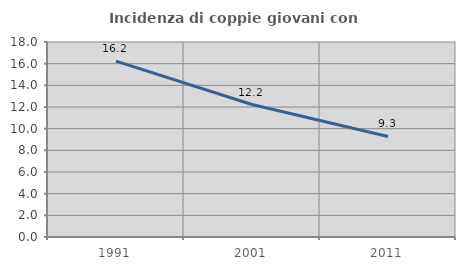
| Category | Incidenza di coppie giovani con figli |
|---|---|
| 1991.0 | 16.237 |
| 2001.0 | 12.229 |
| 2011.0 | 9.284 |